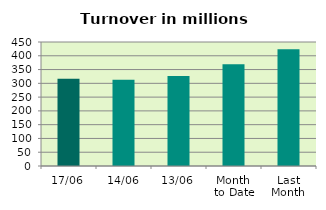
| Category | Series 0 |
|---|---|
| 17/06 | 316.199 |
| 14/06 | 313.335 |
| 13/06 | 326.432 |
| Month 
to Date | 369.181 |
| Last
Month | 424.091 |